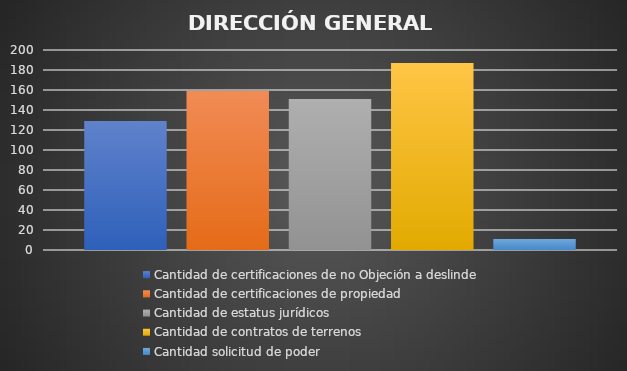
| Category | Cantidad de certificaciones de no Objeción a deslinde | Cantidad de certificaciones de propiedad | Cantidad de estatus jurídicos | Cantidad de contratos de terrenos | Cantidad solicitud de poder  |
|---|---|---|---|---|---|
| 0 | 129 | 159 | 151 | 187 | 11 |